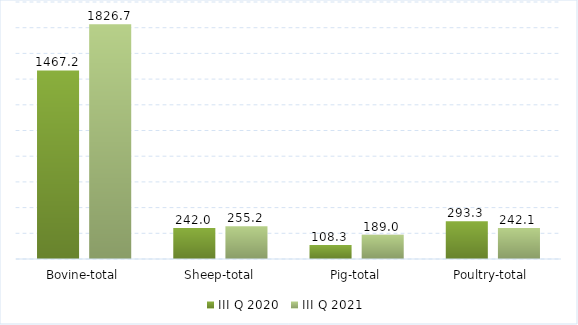
| Category | III Q 2020 | III Q 2021 |
|---|---|---|
| Bovine-total | 1467.2 | 1826.695 |
| Sheep-total | 242 | 255.164 |
| Pig-total | 108.3 | 188.995 |
| Poultry-total | 293.3 | 242.1 |